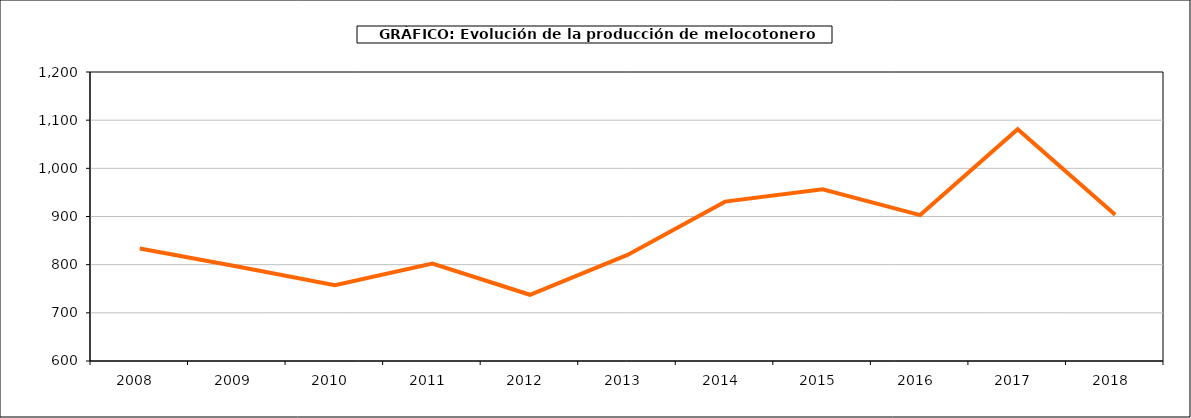
| Category | producción melocotonero |
|---|---|
| 2008.0 | 833.409 |
| 2009.0 | 796.145 |
| 2010.0 | 757.34 |
| 2011.0 | 802.391 |
| 2012.0 | 737.531 |
| 2013.0 | 820.139 |
| 2014.0 | 930.862 |
| 2015.0 | 956.688 |
| 2016.0 | 902.884 |
| 2017.0 | 1081.157 |
| 2018.0 | 903.809 |